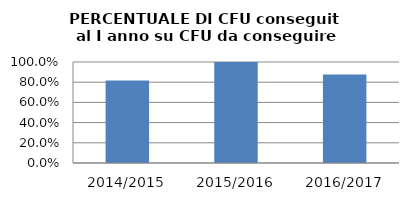
| Category | 2014/2015 2015/2016 2016/2017 |
|---|---|
| 2014/2015 | 0.818 |
| 2015/2016 | 1.001 |
| 2016/2017 | 0.877 |